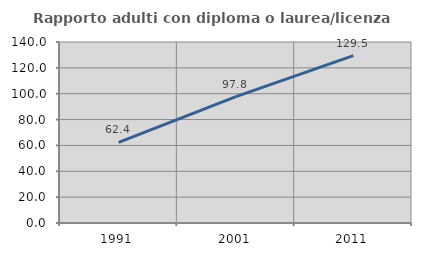
| Category | Rapporto adulti con diploma o laurea/licenza media  |
|---|---|
| 1991.0 | 62.353 |
| 2001.0 | 97.756 |
| 2011.0 | 129.466 |